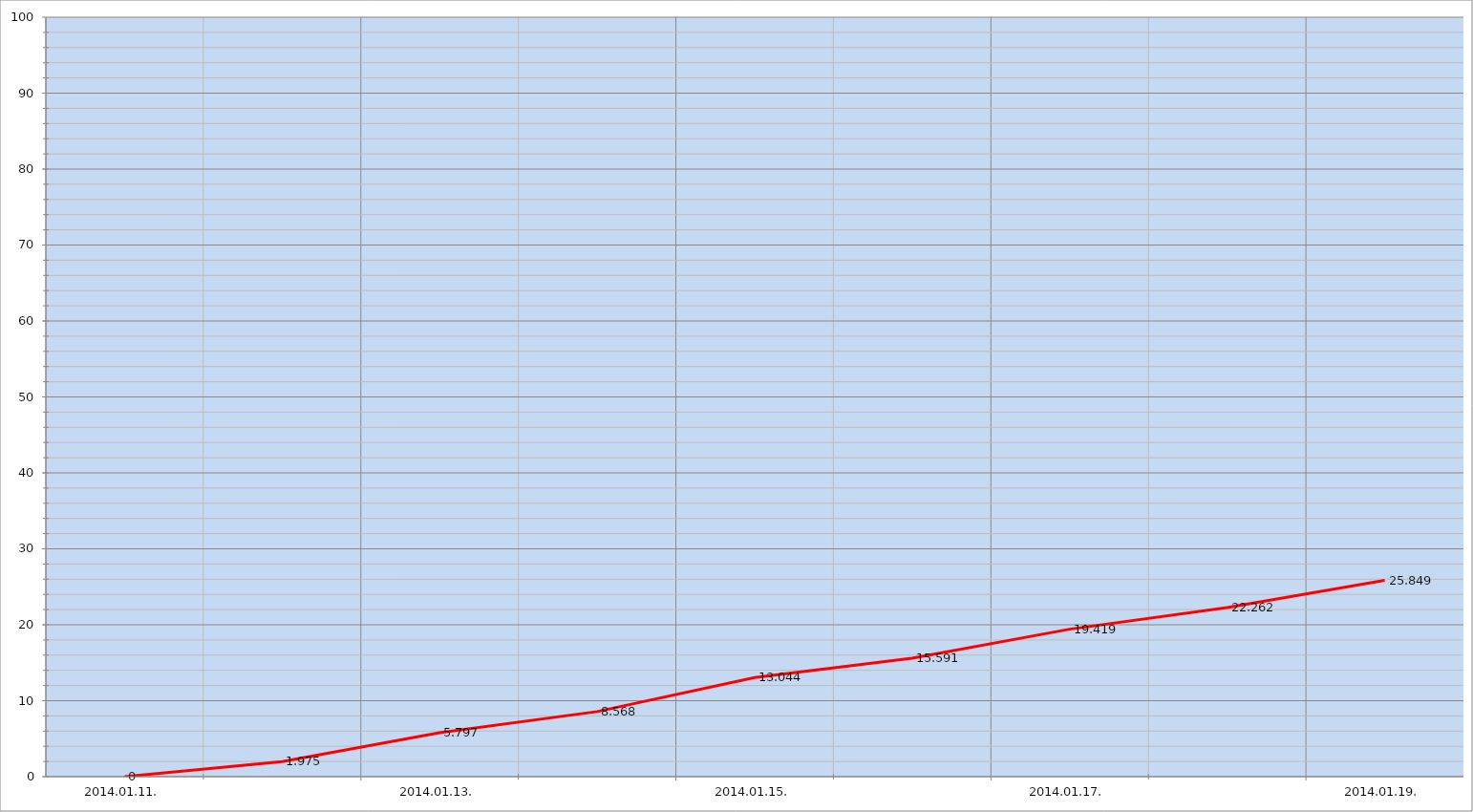
| Category | Szerver 10 |
|---|---|
| 2014-01-11 | 0 |
| 2014-01-12 | 1.975 |
| 2014-01-13 | 5.797 |
| 2014-01-14 | 8.568 |
| 2014-01-15 | 13.044 |
| 2014-01-16 | 15.591 |
| 2014-01-17 | 19.419 |
| 2014-01-18 | 22.262 |
| 2014-01-19 | 25.849 |